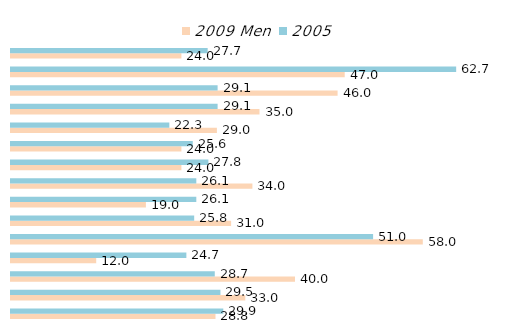
| Category | 2009 Men | 2005 |
|---|---|---|
| Algeria | 28.8 | 29.9 |
| Morocco | 33 | 29.5 |
| Egypt | 40 | 28.7 |
| Oman | 12 | 24.7 |
| Tunisia | 58 | 51 |
| Iraq | 31 | 25.8 |
| UAE | 19 | 26.1 |
| Bahrain | 34 | 26.1 |
| Sudan (Former) | 24 | 27.8 |
| Saudi Arabia | 24 | 25.6 |
| Mauritania | 29 | 22.3 |
| Yemen | 35 | 29.1 |
| Lebanon | 46 | 29.1 |
| Jordan | 47 | 62.7 |
| Comoros | 24 | 27.7 |